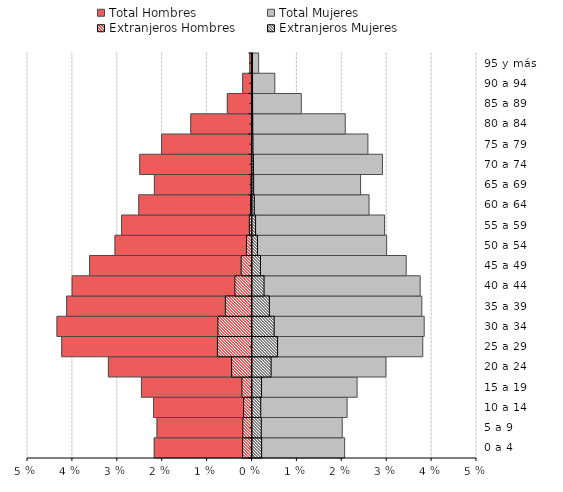
| Category | Total Hombres | Total Mujeres | Extranjeros Hombres | Extranjeros Mujeres |
|---|---|---|---|---|
| 0 a 4 | -0.022 | 0.021 | -0.002 | 0.002 |
| 5 a 9 | -0.021 | 0.02 | -0.002 | 0.002 |
| 10 a 14 | -0.022 | 0.021 | -0.002 | 0.002 |
| 15 a 19 | -0.025 | 0.023 | -0.002 | 0.002 |
| 20 a 24 | -0.032 | 0.03 | -0.005 | 0.004 |
| 25 a 29 | -0.042 | 0.038 | -0.008 | 0.006 |
| 30 a 34 | -0.043 | 0.038 | -0.008 | 0.005 |
| 35 a 39 | -0.041 | 0.038 | -0.006 | 0.004 |
| 40 a 44 | -0.04 | 0.037 | -0.004 | 0.003 |
| 45 a 49 | -0.036 | 0.034 | -0.002 | 0.002 |
| 50 a 54 | -0.031 | 0.03 | -0.001 | 0.001 |
| 55 a 59 | -0.029 | 0.029 | -0.001 | 0.001 |
| 60 a 64 | -0.025 | 0.026 | 0 | 0 |
| 65 a 69 | -0.022 | 0.024 | 0 | 0 |
| 70 a 74 | -0.025 | 0.029 | 0 | 0 |
| 75 a 79 | -0.02 | 0.026 | 0 | 0 |
| 80 a 84 | -0.014 | 0.021 | 0 | 0 |
| 85 a 89 | -0.005 | 0.011 | 0 | 0 |
| 90 a 94 | -0.002 | 0.005 | 0 | 0 |
| 95 y más | 0 | 0.001 | 0 | 0 |